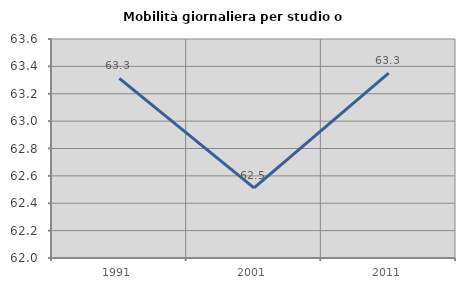
| Category | Mobilità giornaliera per studio o lavoro |
|---|---|
| 1991.0 | 63.312 |
| 2001.0 | 62.513 |
| 2011.0 | 63.35 |